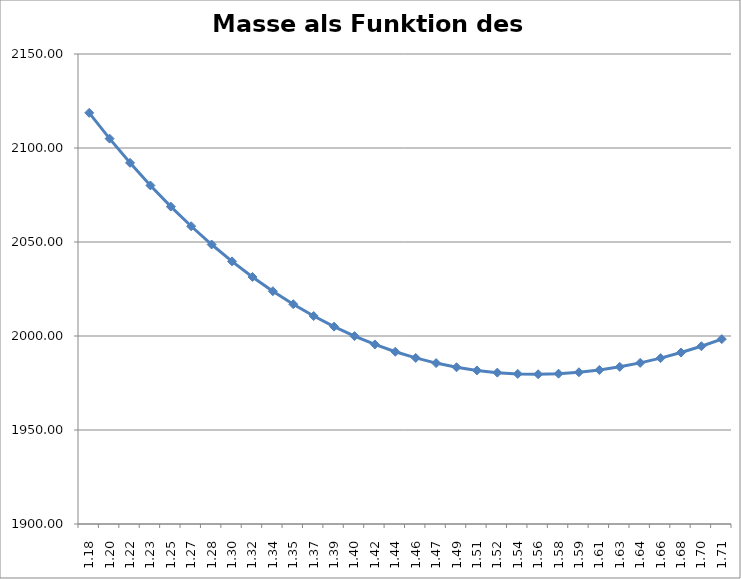
| Category | Masse/Radius |
|---|---|
| 1.181920733213357 | 2118.715 |
| 1.1990500192019564 | 2104.986 |
| 1.2161793051905558 | 2092.116 |
| 1.2333085911791553 | 2080.076 |
| 1.2504378771677547 | 2068.838 |
| 1.267567163156354 | 2058.378 |
| 1.2846964491449535 | 2048.669 |
| 1.301825735133553 | 2039.688 |
| 1.3189550211221523 | 2031.414 |
| 1.3360843071107518 | 2023.826 |
| 1.3532135930993512 | 2016.902 |
| 1.3703428790879506 | 2010.626 |
| 1.38747216507655 | 2004.977 |
| 1.4046014510651494 | 1999.94 |
| 1.4217307370537489 | 1995.498 |
| 1.4388600230423483 | 1991.635 |
| 1.4559893090309477 | 1988.336 |
| 1.4731185950195471 | 1985.588 |
| 1.4902478810081465 | 1983.378 |
| 1.507377166996746 | 1981.691 |
| 1.5245064529853454 | 1980.516 |
| 1.5416357389739448 | 1979.841 |
| 1.5587650249625442 | 1979.655 |
| 1.5758943109511436 | 1979.947 |
| 1.593023596939743 | 1980.708 |
| 1.6101528829283425 | 1981.926 |
| 1.6272821689169419 | 1983.593 |
| 1.6444114549055413 | 1985.699 |
| 1.6615407408941407 | 1988.236 |
| 1.6786700268827401 | 1991.196 |
| 1.6957993128713396 | 1994.571 |
| 1.712928598859939 | 1998.353 |